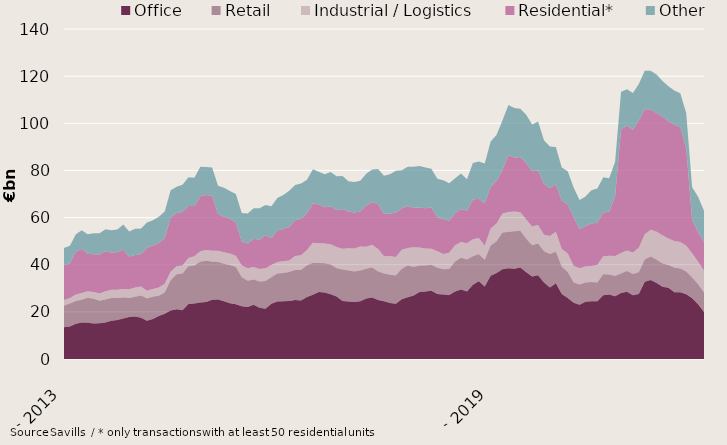
| Category | Office | Retail | Industrial / Logistics | Residential* | Other |
|---|---|---|---|---|---|
| 2013-12-01 | 13450085518.72 | 9187102030.91 | 2347240569.98 | 14839189260.74 | 7243337261.45 |
| 2014-01-01 | 13744501529.72 | 9851068493.92 | 2318485717.98 | 14690274441.74 | 7481728684.45 |
| 2014-02-01 | 14971075983.22 | 9673463303.24 | 2768349976.98 | 18105536458.24 | 7447133016.17 |
| 2014-03-01 | 15462591772.58 | 9654351125.74 | 2833117356.98 | 18788331922.24 | 7894201732.17 |
| 2014-04-01 | 15340245877.58 | 10607660669.74 | 2834100536.98 | 15912594110.24 | 8189954938.17 |
| 2014-05-01 | 15026998733.58 | 10546963482.24 | 2845864408.98 | 15985891426.24 | 8946166038.17 |
| 2014-06-01 | 15124322325.66 | 9544432647.24 | 3105506584.98 | 16600111315.18 | 8991377388.38 |
| 2014-07-01 | 15448732963.88 | 9841966235.24 | 3440852401.98 | 16949735532.68 | 9378736034.61 |
| 2014-08-01 | 16202650242.88 | 9636967715.24 | 3573059549.98 | 15649735374.68 | 9567173270.13 |
| 2014-09-01 | 16540559929.08 | 9353804856.84 | 3506391505.5 | 16011360713.68 | 9578863130.17 |
| 2014-10-01 | 17171487968.08 | 8866837530.84 | 3656699955.5 | 16676134819.88 | 10730952073.17 |
| 2014-11-01 | 17813374968.08 | 8117398128.05 | 3665328905.5 | 13926949559.89 | 10567862157.2 |
| 2014-12-01 | 18060975690.74 | 8390279963.03 | 3920968980.31 | 13718641413.41 | 11132525795.81 |
| 2015-01-01 | 17459892204.74 | 9466254593.03 | 3883908572.31 | 13694885050.41 | 10813390235.82 |
| 2015-02-01 | 16253490231.74 | 9403790983.81 | 3308490268.73 | 18198536996.91 | 10732409376.05 |
| 2015-03-01 | 17014558031.53 | 9365302106.81 | 3368654245.73 | 18305200941.91 | 10836415091.98 |
| 2015-04-01 | 18243172783.53 | 8632001669.81 | 3468694360.68 | 18878550268.91 | 11177168923.98 |
| 2015-05-01 | 19228290474.45 | 8968092469.31 | 3728635607.68 | 19450093150.91 | 11222836416.98 |
| 2015-06-01 | 20613024085.83 | 12835460483.14 | 3559231021.83 | 23020549786.51 | 11567758082.75 |
| 2015-07-01 | 21096337533.5 | 14845940919.21 | 3371725415.86 | 22588207592.35 | 11136948094.21 |
| 2015-08-01 | 20672725633.5 | 15562941505.21 | 3450767146.86 | 22635118357.35 | 11619805261.21 |
| 2015-09-01 | 23300473453.46 | 16001092585.73 | 3520511283.36 | 22065141963.35 | 12257234886.21 |
| 2015-10-01 | 23499972857.46 | 16181040556.36 | 3919085482.36 | 21292965650.35 | 11965577367.21 |
| 2015-11-01 | 23955623619.14 | 17339041737.5 | 4397719316.13 | 23395398176.29 | 12421639283.38 |
| 2015-12-01 | 24195813697.48 | 17455198961.04 | 4557113724.92 | 23319336016.77 | 11953978194.75 |
| 2016-01-01 | 25133300628.48 | 16138997225.45 | 4662502872.92 | 23277671921.77 | 12013959045.24 |
| 2016-02-01 | 25288314349.53 | 15820090497.99 | 4833139363.87 | 15563498654.77 | 11993953720.01 |
| 2016-03-01 | 24528444202.74 | 15865699828.72 | 4877967507.07 | 15108592339.77 | 12303880326.08 |
| 2016-04-01 | 23661528105.74 | 16254770286.07 | 4833846127.82 | 14760671477.37 | 11741957541.08 |
| 2016-05-01 | 23252591507.82 | 15809944380.07 | 4749671116.82 | 14232081715.37 | 11964556735.04 |
| 2016-06-01 | 22417729844.36 | 12232494883.06 | 4999570420.67 | 10189436595.87 | 12052576140.06 |
| 2016-07-01 | 22107590925.69 | 11125435985.56 | 5312245465.64 | 10404072475.53 | 12802090834.96 |
| 2016-08-01 | 23014103074.69 | 10746738868.56 | 5247332254.55 | 12050427222.53 | 12844367434.96 |
| 2016-09-01 | 21714752253.73 | 11146501725.47 | 5270185116.55 | 12465620399.13 | 13401325786.26 |
| 2016-10-01 | 21370279446.86 | 11740308168.84 | 5398267322.55 | 14070034790.02 | 12750064856.83 |
| 2016-11-01 | 23412513086.76 | 11239816740.7 | 5243284144.73 | 11380146617.09 | 13519628479.66 |
| 2016-12-01 | 24351240228.4 | 11942470429.99 | 4890351002.13 | 13331201908.09 | 13795642420.64 |
| 2017-01-01 | 24549608793.4 | 11953863686.96 | 4924744810.37 | 13729696509.09 | 14374441491.58 |
| 2017-02-01 | 24562929822.41 | 12378572437.09 | 4842785725 | 14267858145.09 | 15334823384.58 |
| 2017-03-01 | 25019801711.4 | 12787832178.37 | 5899654543.8 | 15167920484.39 | 14896863125.58 |
| 2017-04-01 | 24857790861.71 | 12853010576.9 | 6262060580.1 | 15489114794.79 | 15001124286.67 |
| 2017-05-01 | 26270396283.47 | 13514985630.15 | 6483702097.1 | 15522287182.8 | 14232593390.28 |
| 2017-06-01 | 27250966704.1 | 13474043478.5 | 8562546401.46 | 16801850396.39 | 14405141008.56 |
| 2017-07-01 | 28457851498.1 | 12322239347.93 | 8324132158.46 | 16480355706.39 | 13885696506.2 |
| 2017-08-01 | 28173334177.1 | 12429029136.93 | 8386695707.55 | 15442529308.39 | 13960768551.2 |
| 2017-09-01 | 27481692685.45 | 12637830917.94 | 8510058041.55 | 16123359085.78 | 14609395352.74 |
| 2017-10-01 | 26533835870.32 | 11930960273.94 | 9048046430.46 | 15580068614.87 | 14475314955.17 |
| 2017-11-01 | 24602017291.17 | 13335421843.83 | 8802947546.51 | 16947694524.87 | 13972764751.44 |
| 2017-12-01 | 24417517996.53 | 13089078236.48 | 9470343512.7 | 15610704960.87 | 12851673161.48 |
| 2018-01-01 | 24146432439.53 | 13024200645.1 | 9721702683.46 | 15307451168.86 | 12942092926.04 |
| 2018-02-01 | 24509455676.47 | 12985537030.65 | 10213193365.46 | 14917009796.86 | 12967754022.04 |
| 2018-03-01 | 25665946432.48 | 12663577036.64 | 9307934893.46 | 17524767231.49 | 13400144430.02 |
| 2018-04-01 | 26100570225.17 | 12722345110.76 | 9605919650.46 | 18204136136.49 | 13789327041.93 |
| 2018-05-01 | 25038149939.41 | 12092663746.51 | 9488564046.46 | 19015064846.48 | 14965132307.36 |
| 2018-06-01 | 24481115751.78 | 11810463263.34 | 7330050155.1 | 17955943579.56 | 16157272195.08 |
| 2018-07-01 | 23747042589.78 | 11960863126.32 | 7966869588.1 | 18082211683.56 | 16648474999.19 |
| 2018-08-01 | 23489045993.76 | 11885701905.19 | 7898300709.1 | 18779877058.41 | 17793874874.04 |
| 2018-09-01 | 25320157454.41 | 12927853979.55 | 8136141438.1 | 17594307591.42 | 16145169776.21 |
| 2018-10-01 | 26232931200.41 | 13398765782.82 | 7412735586.25 | 17806279798.32 | 16684581539.21 |
| 2018-11-01 | 26888009103.45 | 12145908934.88 | 8401198728.54 | 16739676352.32 | 17402842493.25 |
| 2018-12-01 | 28422231271.45 | 11248285254.68 | 7673095490.35 | 16935559846.32 | 17632585774.26 |
| 2019-01-01 | 28635473432.45 | 10984616615.68 | 7220623719.35 | 17121877027.2 | 17246204869.26 |
| 2019-02-01 | 28948931101.45 | 10992187442.4 | 6837562259.96 | 17475124974.2 | 16490034059.62 |
| 2019-03-01 | 27555530410.45 | 11171202657.26 | 6991519187.16 | 14435875855.27 | 16359201447.64 |
| 2019-04-01 | 27383608368.31 | 10721779269.12 | 6442702186.06 | 14851488460.14 | 16397037534.89 |
| 2019-05-01 | 27125214864.31 | 11007377577.12 | 6933871752.06 | 13578486873.14 | 15876648230.89 |
| 2019-06-01 | 28658164907.82 | 12738169920.09 | 6816220057.06 | 13614047047.47 | 14828908741.96 |
| 2019-07-01 | 29521017907.29 | 13385300761.26 | 6734975032.06 | 13997066612.47 | 15034559896.92 |
| 2019-08-01 | 28617484323.31 | 13638029313.39 | 6860393893.06 | 13732511102.62 | 13393418208.07 |
| 2019-09-01 | 31460531128.25 | 12091023494.97 | 7256389082.92 | 16840249545.62 | 15519458025.83 |
| 2019-10-01 | 33025371490.25 | 11371608887.7 | 6895687562.55 | 16682300148.74 | 15815899476.83 |
| 2019-11-01 | 30776429897.78 | 11335647756.75 | 5893842897.79 | 18031124443.74 | 16865032442.52 |
| 2019-12-01 | 35351505929.49 | 12781157931.88 | 7226755920.45 | 17715667348.74 | 19228942136.48 |
| 2020-01-01 | 36511601661.49 | 13487927499.88 | 7453722361.23 | 18152920102.87 | 19552288754.48 |
| 2020-02-01 | 38069718725.44 | 15551306208.37 | 8154238247.38 | 18359461221.37 | 21141837892.2 |
| 2020-03-01 | 38521512931.89 | 15394481027.15 | 8471027173.18 | 24045743487.37 | 21308963300.78 |
| 2020-04-01 | 38241511051.03 | 15909355259.17 | 8455055344.28 | 22903801936.5 | 20964956351.53 |
| 2020-05-01 | 38808219687.03 | 15549925373.17 | 7866152944.28 | 23331791777.5 | 20643494227.49 |
| 2020-06-01 | 36790527438.52 | 14238996200.21 | 8181133859.28 | 24099048462.5 | 20285170820.42 |
| 2020-07-01 | 35007246986.05 | 13278324936.06 | 7895945113.28 | 23512544941.5 | 19763940670.72 |
| 2020-08-01 | 35582806023.05 | 13412518372.06 | 7902530160.28 | 23019438157.5 | 20885116002.21 |
| 2020-09-01 | 32466831295.11 | 13297682052.68 | 6992037104.42 | 21488103702.49 | 18555746038.08 |
| 2020-10-01 | 30286483024.11 | 14221705631.68 | 7651543536.73 | 20371879725.49 | 17591918455.54 |
| 2020-11-01 | 32183316976.11 | 13312476504.68 | 8499668008.2 | 20089398385.49 | 15906053075.98 |
| 2020-12-01 | 27533815291.4 | 11655363859.74 | 7444892352.54 | 20512288435.49 | 14083253436.88 |
| 2021-01-01 | 25878363674.4 | 11075819505.74 | 7779280078.76 | 20716309315.49 | 14187132363.79 |
| 2021-02-01 | 23875141256.45 | 8606485673.53 | 7041233082 | 20712784697.99 | 12542726051.47 |
| 2021-03-01 | 23067917338 | 8523236215.89 | 6892063505.99 | 16648692848.99 | 12309955277.25 |
| 2021-04-01 | 24334897520 | 8113975264.01 | 6771387226.99 | 17196667013.99 | 12525889052.25 |
| 2021-05-01 | 24467771288 | 8241758249.01 | 6790507487.99 | 17960984016.99 | 14159888506.29 |
| 2021-06-01 | 24541203145 | 7897867696 | 7433356567.99 | 17981040212.99 | 14502376306.91 |
| 2021-07-01 | 27089559780 | 8867577945 | 7654402804.99 | 18540669487.74 | 14924053708.54 |
| 2021-08-01 | 27374136255 | 8496011870 | 7941811530.96 | 18656239563.74 | 14165059621.05 |
| 2021-09-01 | 26573784518 | 8594389539.91 | 8513470029.96 | 25384180018.75 | 14593021701.41 |
| 2021-10-01 | 27976297965.69 | 8304682150.91 | 8718556719.96 | 52355288139.75 | 16020356045.32 |
| 2021-11-01 | 28520610963.69 | 8822564326.91 | 8723527233.96 | 52970740980.75 | 15386159687.88 |
| 2021-12-01 | 27052751872.69 | 9008257446.86 | 9077587684.96 | 52129464280.25 | 15626665194.02 |
| 2022-01-01 | 27603895110.69 | 9232885506.07 | 10383777571.97 | 53924254784.25 | 15514328177.11 |
| 2022-02-01 | 32751827958.24 | 9506728851.13 | 10704097643.97 | 53013230641.79 | 16352496967.21 |
| 2022-03-01 | 33483653395.27 | 9995103726.43 | 11389710614.93 | 51006955075.79 | 16389042138.52 |
| 2022-04-01 | 32238917595.27 | 9914022761.43 | 11812991651.93 | 50403831443.79 | 16290702443.52 |
| 2022-05-01 | 30694481747.27 | 9844391341.43 | 11974283780.93 | 50320479483.79 | 15156734664.52 |
| 2022-06-01 | 30198592788.74 | 9640591662.42 | 11289713589.93 | 49787200566.79 | 14847182553.36 |
| 2022-07-01 | 28346872898.34 | 10379733970.8 | 11343332658.93 | 49311827068.04 | 14528943530.36 |
| 2022-08-01 | 28277994575.34 | 10155856205.8 | 11236778843.96 | 48791249059.02 | 14287157781.36 |
| 2022-09-01 | 27467303500.34 | 9601694995.89 | 10988734907.96 | 41331347635.69 | 14928138140.31 |
| 2022-10-01 | 25748352538.65 | 8862007171.89 | 10227807063.96 | 14252988159.69 | 13807988330.92 |
| 2022-11-01 | 23274564477.09 | 8385032516.89 | 9574534462.96 | 12691908605.69 | 14934254608.84 |
| 2022-12-01 | 19915982739.09 | 8336062553.94 | 9255153499.96 | 12249491364.19 | 13102310939.84 |